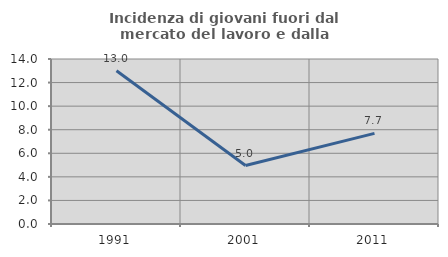
| Category | Incidenza di giovani fuori dal mercato del lavoro e dalla formazione  |
|---|---|
| 1991.0 | 13.008 |
| 2001.0 | 4.959 |
| 2011.0 | 7.692 |